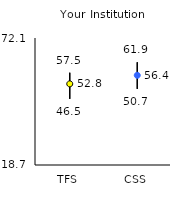
| Category | 25th | 75th | Mean |
|---|---|---|---|
| TFS | 46.5 | 57.5 | 52.81 |
| CSS | 50.7 | 61.9 | 56.41 |